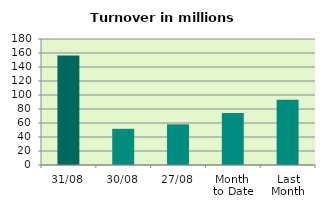
| Category | Series 0 |
|---|---|
| 31/08 | 156.437 |
| 30/08 | 51.667 |
| 27/08 | 58.128 |
| Month 
to Date | 74.221 |
| Last
Month | 93.279 |